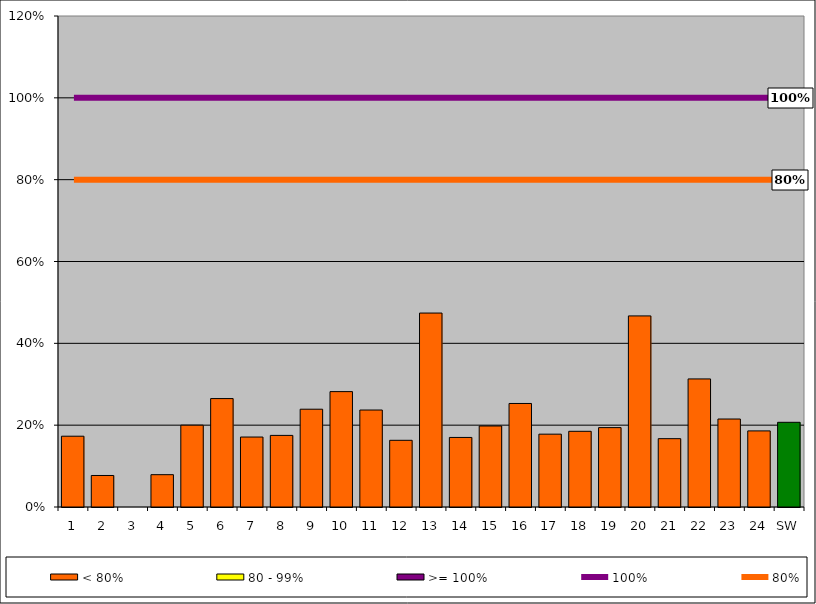
| Category | < 80% | 80 - 99% | >= 100% |
|---|---|---|---|
| 1 | 0.173 | 0 | 0 |
| 2 | 0.077 | 0 | 0 |
| 3 | 0 | 0 | 0 |
| 4 | 0.079 | 0 | 0 |
| 5 | 0.2 | 0 | 0 |
| 6 | 0.265 | 0 | 0 |
| 7 | 0.171 | 0 | 0 |
| 8 | 0.175 | 0 | 0 |
| 9 | 0.239 | 0 | 0 |
| 10 | 0.282 | 0 | 0 |
| 11 | 0.237 | 0 | 0 |
| 12 | 0.163 | 0 | 0 |
| 13 | 0.474 | 0 | 0 |
| 14 | 0.17 | 0 | 0 |
| 15 | 0.198 | 0 | 0 |
| 16 | 0.253 | 0 | 0 |
| 17 | 0.178 | 0 | 0 |
| 18 | 0.185 | 0 | 0 |
| 19 | 0.194 | 0 | 0 |
| 20 | 0.467 | 0 | 0 |
| 21 | 0.167 | 0 | 0 |
| 22 | 0.313 | 0 | 0 |
| 23 | 0.215 | 0 | 0 |
| 24 | 0.186 | 0 | 0 |
| SW | 0.207 | 0 | 0 |